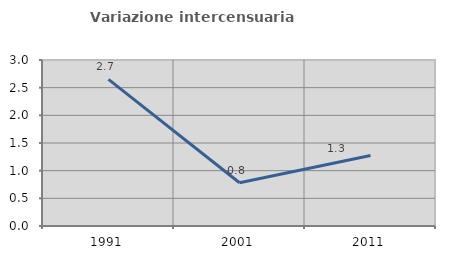
| Category | Variazione intercensuaria annua |
|---|---|
| 1991.0 | 2.65 |
| 2001.0 | 0.782 |
| 2011.0 | 1.276 |